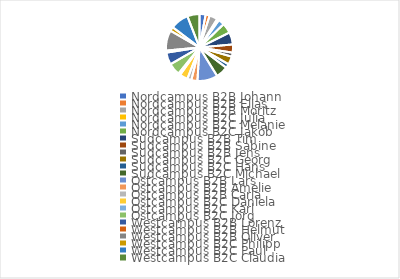
| Category | Umsatz |
|---|---|
| 0 | 300 |
| 1 | 200 |
| 2 | 400 |
| 3 | 100 |
| 4 | 300 |
| 5 | 500 |
| 6 | 600 |
| 7 | 400 |
| 8 | 200 |
| 9 | 400 |
| 10 | 200 |
| 11 | 600 |
| 12 | 1000 |
| 13 | 300 |
| 14 | 200 |
| 15 | 400 |
| 16 | 100 |
| 17 | 600 |
| 18 | 600 |
| 19 | 100 |
| 20 | 1000 |
| 21 | 200 |
| 22 | 900 |
| 23 | 600 |